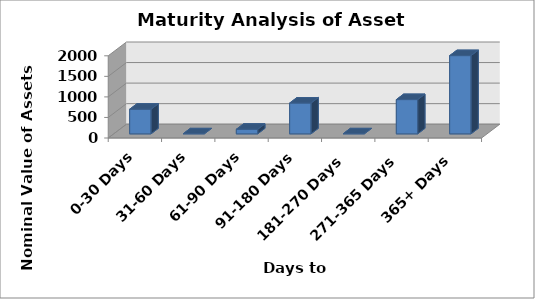
| Category | Nominal |
|---|---|
| 0-30 Days | 600000000 |
| 31-60 Days | 0 |
| 61-90 Days | 111639865.002 |
| 91-180 Days | 750000000 |
| 181-270 Days | 0 |
| 271-365 Days | 834050191 |
| 365+ Days | 1903772549.773 |